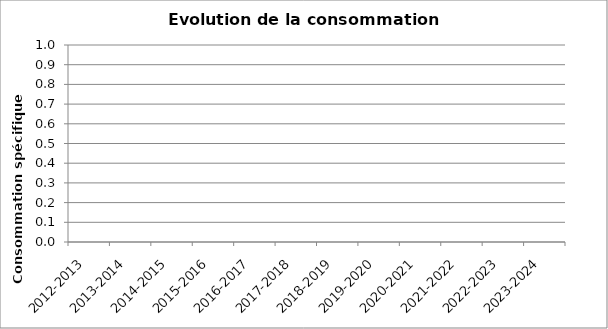
| Category | Series 0 |
|---|---|
| 2012-2013 | 0 |
| 2013-2014 | 0 |
| 2014-2015 | 0 |
| 2015-2016 | 0 |
| 2016-2017 | 0 |
| 2017-2018 | 0 |
| 2018-2019 | 0 |
| 2019-2020 | 0 |
| 2020-2021 | 0 |
| 2021-2022 | 0 |
| 2022-2023 | 0 |
| 2023-2024 | 0 |